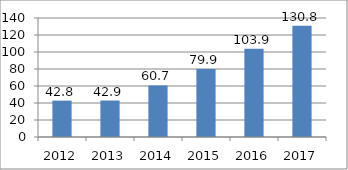
| Category | Series 0 |
|---|---|
| 2012.0 | 42.8 |
| 2013.0 | 42.9 |
| 2014.0 | 60.7 |
| 2015.0 | 79.9 |
| 2016.0 | 103.9 |
| 2017.0 | 130.8 |